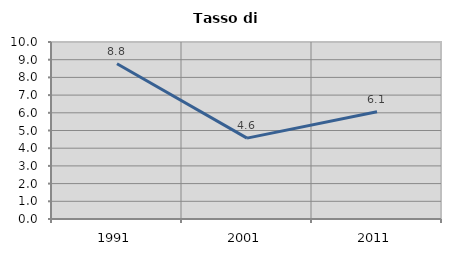
| Category | Tasso di disoccupazione   |
|---|---|
| 1991.0 | 8.772 |
| 2001.0 | 4.569 |
| 2011.0 | 6.061 |